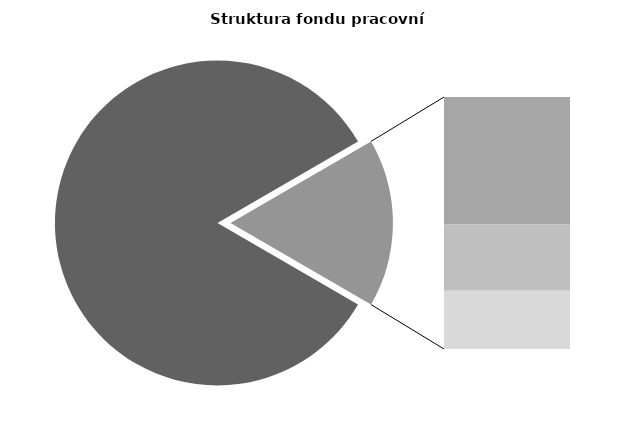
| Category | Series 0 |
|---|---|
| Průměrná měsíční odpracovaná doba bez přesčasu | 141.601 |
| Dovolená | 14.405 |
| Nemoc | 7.493 |
| Jiné | 6.581 |